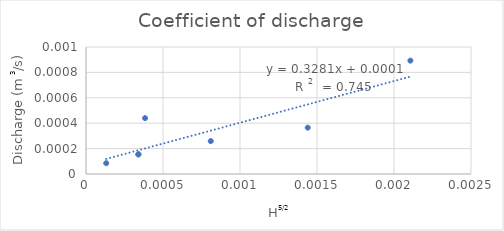
| Category | QA (m3/s) |
|---|---|
| 0.0008101584832611452 | 0 |
| 0.00013118829216054312 | 0 |
| 0.0003403765576534317 | 0 |
| 0.00038341680062302933 | 0 |
| 0.002106431372012865 | 0.001 |
| 0.0003403765576534317 | 0 |
| 0.0014398165136572092 | 0 |